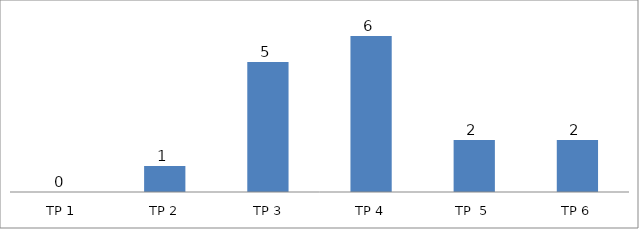
| Category | BIL. MURID |
|---|---|
| TP 1 | 0 |
| TP 2 | 1 |
|  TP 3 | 5 |
| TP 4 | 6 |
| TP  5 | 2 |
| TP 6 | 2 |